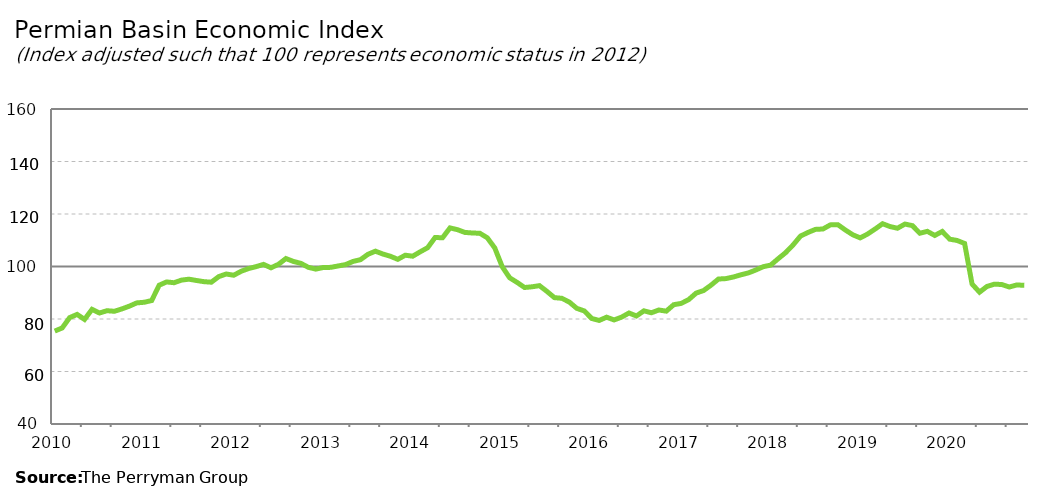
| Category | Permian Basin Composite |
|---|---|
| 2010-01-31 | 75.394 |
| 2010-02-28 | 76.586 |
| 2010-03-31 | 80.52 |
| 2010-04-30 | 81.749 |
| 2010-05-31 | 79.835 |
| 2010-06-30 | 83.674 |
| 2010-07-31 | 82.286 |
| 2010-08-31 | 83.158 |
| 2010-09-30 | 82.938 |
| 2010-10-31 | 83.838 |
| 2010-11-30 | 84.887 |
| 2010-12-31 | 86.137 |
| 2011-01-31 | 86.373 |
| 2011-02-28 | 87.033 |
| 2011-03-31 | 92.871 |
| 2011-04-30 | 94.121 |
| 2011-05-31 | 93.823 |
| 2011-06-30 | 94.818 |
| 2011-07-31 | 95.167 |
| 2011-08-31 | 94.674 |
| 2011-09-30 | 94.226 |
| 2011-10-31 | 94.019 |
| 2011-11-30 | 96.166 |
| 2011-12-31 | 97.141 |
| 2012-01-31 | 96.669 |
| 2012-02-29 | 98.185 |
| 2012-03-31 | 99.226 |
| 2012-04-30 | 99.947 |
| 2012-05-31 | 100.797 |
| 2012-06-30 | 99.511 |
| 2012-07-31 | 100.837 |
| 2012-08-31 | 103.032 |
| 2012-09-30 | 101.929 |
| 2012-10-31 | 101.204 |
| 2012-11-30 | 99.693 |
| 2012-12-31 | 99.003 |
| 2013-01-31 | 99.619 |
| 2013-02-28 | 99.672 |
| 2013-03-31 | 100.203 |
| 2013-04-30 | 100.725 |
| 2013-05-31 | 101.934 |
| 2013-06-30 | 102.603 |
| 2013-07-31 | 104.647 |
| 2013-08-31 | 105.834 |
| 2013-09-30 | 104.752 |
| 2013-10-31 | 103.907 |
| 2013-11-30 | 102.733 |
| 2013-12-31 | 104.299 |
| 2014-01-31 | 103.923 |
| 2014-02-28 | 105.59 |
| 2014-03-31 | 107.157 |
| 2014-04-30 | 111.036 |
| 2014-05-31 | 110.963 |
| 2014-06-30 | 114.699 |
| 2014-07-31 | 114.031 |
| 2014-08-31 | 112.98 |
| 2014-09-30 | 112.765 |
| 2014-10-31 | 112.661 |
| 2014-11-30 | 110.931 |
| 2014-12-31 | 107.08 |
| 2015-01-31 | 99.926 |
| 2015-02-28 | 95.695 |
| 2015-03-31 | 93.934 |
| 2015-04-30 | 91.995 |
| 2015-05-31 | 92.269 |
| 2015-06-30 | 92.707 |
| 2015-07-31 | 90.503 |
| 2015-08-31 | 88.145 |
| 2015-09-30 | 87.879 |
| 2015-10-31 | 86.449 |
| 2015-11-30 | 84.051 |
| 2015-12-31 | 83.086 |
| 2016-01-31 | 80.199 |
| 2016-02-29 | 79.451 |
| 2016-03-31 | 80.69 |
| 2016-04-30 | 79.644 |
| 2016-05-31 | 80.694 |
| 2016-06-30 | 82.282 |
| 2016-07-31 | 81.151 |
| 2016-08-31 | 83.11 |
| 2016-09-30 | 82.374 |
| 2016-10-31 | 83.427 |
| 2016-11-30 | 82.99 |
| 2016-12-31 | 85.452 |
| 2017-01-31 | 85.941 |
| 2017-02-28 | 87.38 |
| 2017-03-31 | 89.864 |
| 2017-04-30 | 90.841 |
| 2017-05-31 | 92.893 |
| 2017-06-30 | 95.225 |
| 2017-07-31 | 95.39 |
| 2017-08-31 | 96.005 |
| 2017-09-30 | 96.835 |
| 2017-10-31 | 97.548 |
| 2017-11-30 | 98.664 |
| 2017-12-31 | 99.926 |
| 2018-01-31 | 100.534 |
| 2018-02-28 | 102.955 |
| 2018-03-31 | 105.278 |
| 2018-04-30 | 108.21 |
| 2018-05-31 | 111.6 |
| 2018-06-30 | 112.967 |
| 2018-07-31 | 114.139 |
| 2018-08-31 | 114.286 |
| 2018-09-30 | 115.856 |
| 2018-10-31 | 115.938 |
| 2018-11-30 | 113.921 |
| 2018-12-31 | 112.093 |
| 2019-01-31 | 110.901 |
| 2019-02-28 | 112.374 |
| 2019-03-31 | 114.266 |
| 2019-04-30 | 116.3 |
| 2019-05-31 | 115.219 |
| 2019-06-30 | 114.577 |
| 2019-07-31 | 116.169 |
| 2019-08-31 | 115.566 |
| 2019-09-30 | 112.682 |
| 2019-10-31 | 113.39 |
| 2019-11-30 | 111.836 |
| 2019-12-31 | 113.343 |
| 2020-01-31 | 110.414 |
| 2020-02-29 | 109.913 |
| 2020-03-31 | 108.776 |
| 2020-04-30 | 93.328 |
| 2020-05-31 | 90.224 |
| 2020-06-30 | 92.398 |
| 2020-07-31 | 93.275 |
| 2020-08-31 | 93.131 |
| 2020-09-30 | 92.188 |
| 2020-10-01 | 92.976 |
| 2020-11-01 | 92.829 |